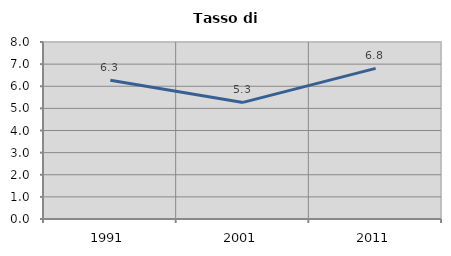
| Category | Tasso di disoccupazione   |
|---|---|
| 1991.0 | 6.271 |
| 2001.0 | 5.27 |
| 2011.0 | 6.808 |